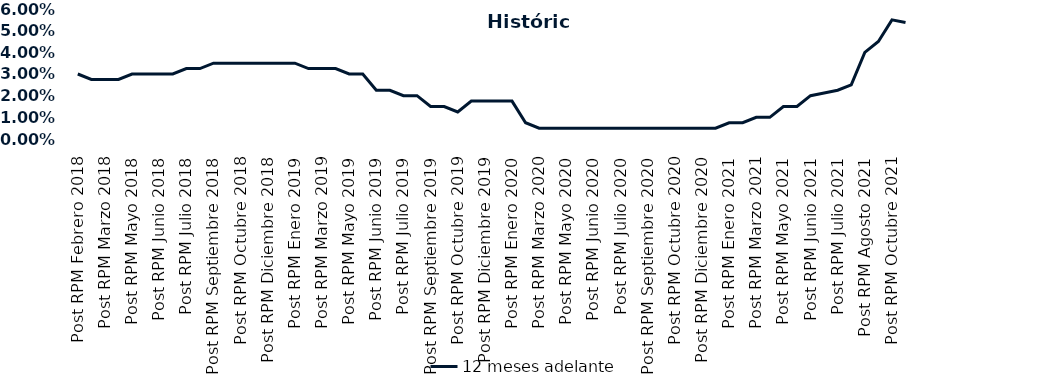
| Category | 12 meses adelante  |
|---|---|
| Post RPM Febrero 2018 | 0.03 |
| Pre RPM Marzo 2018 | 0.028 |
| Post RPM Marzo 2018 | 0.028 |
| Pre RPM Mayo 2018 | 0.028 |
| Post RPM Mayo 2018 | 0.03 |
| Pre RPM Junio 2018 | 0.03 |
| Post RPM Junio 2018 | 0.03 |
| Pre RPM Julio 2018 | 0.03 |
| Post RPM Julio 2018 | 0.032 |
| Pre RPM Septiembre 2018 | 0.032 |
| Post RPM Septiembre 2018 | 0.035 |
| Pre RPM Octubre 2018 | 0.035 |
| Post RPM Octubre 2018 | 0.035 |
| Pre RPM Diciembre 2018 | 0.035 |
| Post RPM Diciembre 2018 | 0.035 |
| Pre RPM Enero 2019 | 0.035 |
| Post RPM Enero 2019 | 0.035 |
| Pre RPM Marzo 2019 | 0.032 |
| Post RPM Marzo 2019 | 0.032 |
| Pre RPM Mayo 2019 | 0.032 |
| Post RPM Mayo 2019 | 0.03 |
| Pre RPM Junio 2019 | 0.03 |
| Post RPM Junio 2019 | 0.022 |
| Pre RPM Julio 2019 | 0.022 |
| Post RPM Julio 2019 | 0.02 |
| Pre RPM Septiembre 2019 | 0.02 |
| Post RPM Septiembre 2019 | 0.015 |
| Pre RPM Octubre 2019 | 0.015 |
| Post RPM Octubre 2019 | 0.012 |
| Pre RPM Diciembre 2019 | 0.018 |
| Post RPM Diciembre 2019 | 0.018 |
| Pre RPM Enero 2020 | 0.018 |
| Post RPM Enero 2020 | 0.018 |
| Pre RPM Marzo 2020 | 0.008 |
| Post RPM Marzo 2020 | 0.005 |
| Pre RPM Mayo 2020 | 0.005 |
| Post RPM Mayo 2020 | 0.005 |
| Pre RPM Junio 2020 | 0.005 |
| Post RPM Junio 2020 | 0.005 |
| Pre RPM Julio 2020 | 0.005 |
| Post RPM Julio 2020 | 0.005 |
| Pre RPM Septiembre 2020 | 0.005 |
| Post RPM Septiembre 2020 | 0.005 |
| Pre RPM Octubre 2020 | 0.005 |
| Post RPM Octubre 2020 | 0.005 |
| Pre RPM Diciembre 2020 | 0.005 |
| Post RPM Diciembre 2020 | 0.005 |
| Pre RPM Enero 2021 | 0.005 |
| Post RPM Enero 2021 | 0.008 |
| Pre RPM Marzo 2021 | 0.008 |
| Post RPM Marzo 2021 | 0.01 |
| Pre RPM Mayo 2021 | 0.01 |
| Post RPM Mayo 2021 | 0.015 |
| Pre RPM Junio 2021 | 0.015 |
| Post RPM Junio 2021 | 0.02 |
| Pre RPM Julio 2021 | 0.021 |
| Post RPM Julio 2021 | 0.022 |
| Pre RPM Agosto 2021 | 0.025 |
| Post RPM Agosto 2021 | 0.04 |
| Pre RPM Octubre 2021 | 0.045 |
| Post RPM Octubre 2021 | 0.055 |
| Pre RPM Diciembre 2021 | 0.054 |